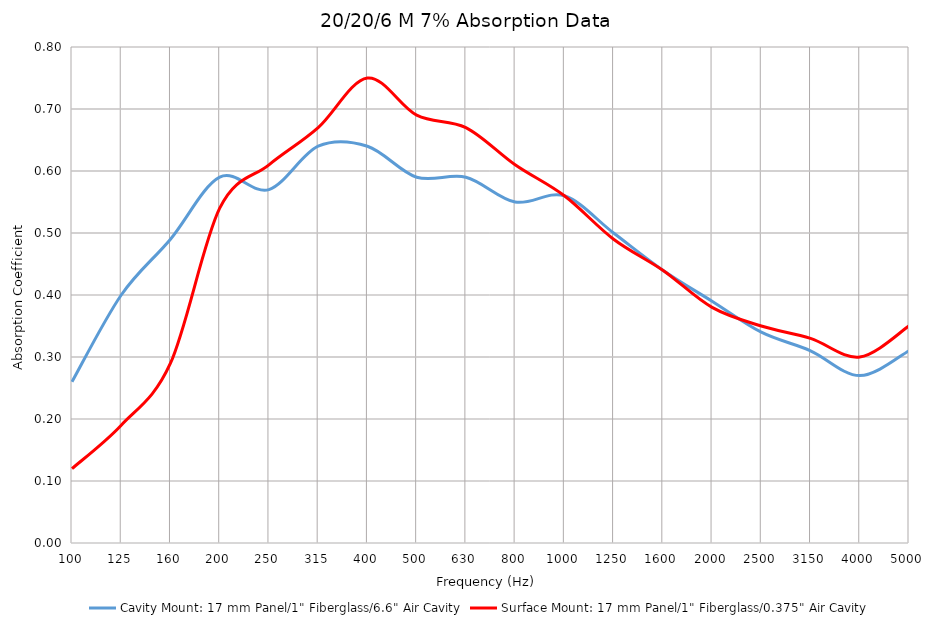
| Category | Cavity Mount: 17 mm Panel/1" Fiberglass/6.6" Air Cavity | Surface Mount: 17 mm Panel/1" Fiberglass/0.375" Air Cavity |
|---|---|---|
| 100.0 | 0.26 | 0.12 |
| 125.0 | 0.4 | 0.19 |
| 160.0 | 0.49 | 0.29 |
| 200.0 | 0.59 | 0.54 |
| 250.0 | 0.57 | 0.61 |
| 315.0 | 0.64 | 0.67 |
| 400.0 | 0.64 | 0.75 |
| 500.0 | 0.59 | 0.69 |
| 630.0 | 0.59 | 0.67 |
| 800.0 | 0.55 | 0.61 |
| 1000.0 | 0.56 | 0.56 |
| 1250.0 | 0.5 | 0.49 |
| 1600.0 | 0.44 | 0.44 |
| 2000.0 | 0.39 | 0.38 |
| 2500.0 | 0.34 | 0.35 |
| 3150.0 | 0.31 | 0.33 |
| 4000.0 | 0.27 | 0.3 |
| 5000.0 | 0.31 | 0.35 |